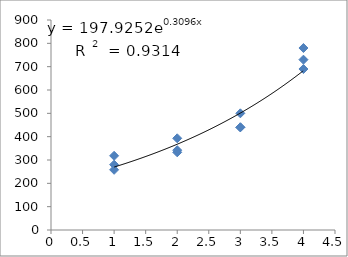
| Category | Series 0 |
|---|---|
| 1.0 | 258 |
| 1.0 | 318 |
| 1.0 | 280 |
| 2.0 | 333 |
| 2.0 | 393 |
| 2.0 | 342 |
| 3.0 | 440 |
| 3.0 | 500 |
| 3.0 | 440 |
| 4.0 | 690 |
| 4.0 | 730 |
| 4.0 | 780 |